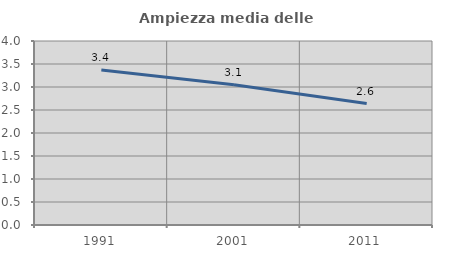
| Category | Ampiezza media delle famiglie |
|---|---|
| 1991.0 | 3.369 |
| 2001.0 | 3.051 |
| 2011.0 | 2.64 |